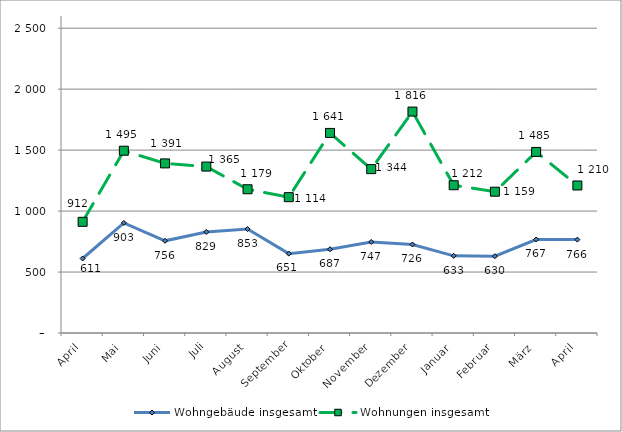
| Category | Wohngebäude insgesamt | Wohnungen insgesamt |
|---|---|---|
| April | 611 | 912 |
| Mai | 903 | 1495 |
| Juni | 756 | 1391 |
| Juli | 829 | 1365 |
| August | 853 | 1179 |
| September | 651 | 1114 |
| Oktober | 687 | 1641 |
| November | 747 | 1344 |
| Dezember | 726 | 1816 |
| Januar | 633 | 1212 |
| Februar | 630 | 1159 |
| März | 767 | 1485 |
| April | 766 | 1210 |